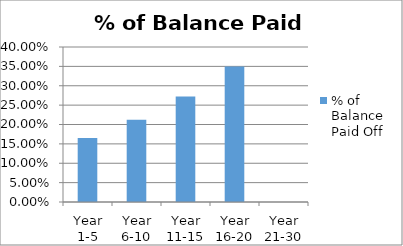
| Category | % of Balance Paid Off |
|---|---|
| Year 1-5 | 0.165 |
| Year 6-10 | 0.212 |
| Year 11-15 | 0.272 |
| Year 16-20 | 0.35 |
| Year 21-30 | 0 |